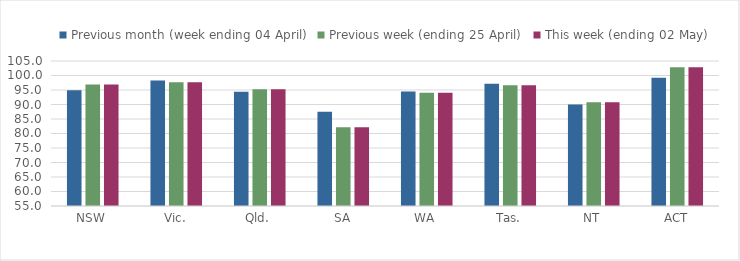
| Category | Previous month (week ending 04 April) | Previous week (ending 25 April) | This week (ending 02 May) |
|---|---|---|---|
| NSW | 94.957 | 96.934 | 96.934 |
| Vic. | 98.303 | 97.667 | 97.667 |
| Qld. | 94.393 | 95.264 | 95.264 |
| SA | 87.537 | 82.185 | 82.185 |
| WA | 94.512 | 94.024 | 94.024 |
| Tas. | 97.133 | 96.68 | 96.68 |
| NT | 89.964 | 90.756 | 90.756 |
| ACT | 99.209 | 102.878 | 102.878 |